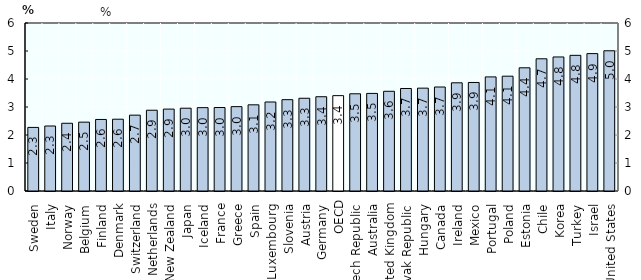
| Category |   2013 (or latest year) |
|---|---|
| Sweden  | 2.271 |
| Italy  | 2.321 |
| Norway  | 2.419 |
| Belgium  | 2.459 |
| Finland  | 2.555 |
| Denmark  | 2.564 |
| Switzerland  | 2.709 |
| Netherlands  | 2.885 |
| New Zealand  | 2.925 |
| Japan  | 2.957 |
| Iceland  | 2.977 |
| France  | 2.982 |
| Greece  | 3.013 |
| Spain  | 3.078 |
| Luxembourg  | 3.179 |
| Slovenia  | 3.262 |
| Austria  | 3.312 |
| Germany  | 3.367 |
| OECD | 3.405 |
| Czech Republic  | 3.472 |
| Australia  | 3.485 |
| United Kingdom  | 3.561 |
| Slovak Republic  | 3.661 |
| Hungary  | 3.673 |
| Canada  | 3.714 |
| Ireland  | 3.864 |
| Mexico  | 3.876 |
| Portugal  | 4.075 |
| Poland  | 4.101 |
| Estonia  | 4.4 |
| Chile  | 4.722 |
| Korea  | 4.787 |
| Turkey  | 4.845 |
| Israel  | 4.907 |
| United States  | 5.008 |